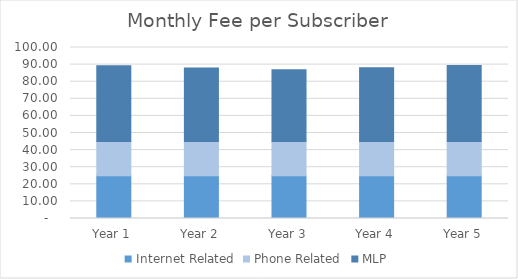
| Category | Internet Related | Phone Related | MLP |
|---|---|---|---|
| Year 1 | 25 | 20 | 44.37 |
| Year 2 | 25 | 20 | 43.04 |
| Year 3 | 25 | 20 | 41.92 |
| Year 4 | 25 | 20 | 43.17 |
| Year 5 | 25 | 20 | 44.46 |